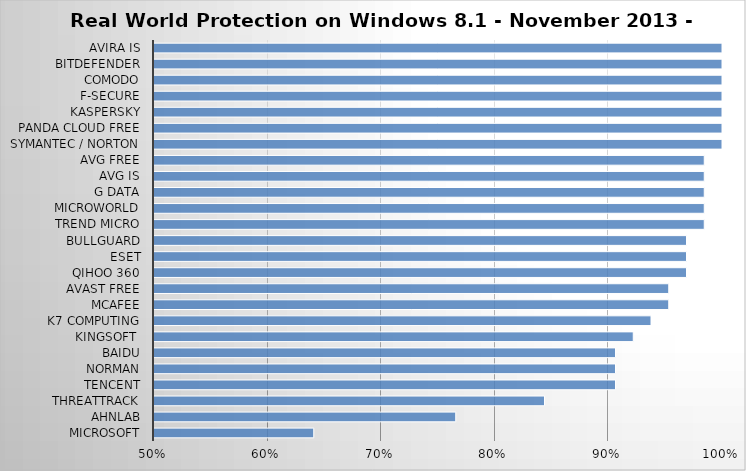
| Category | Series 0 |
|---|---|
| Microsoft | 0.641 |
| AhnLab | 0.766 |
| ThreatTrack | 0.844 |
| Tencent | 0.906 |
| Norman | 0.906 |
| Baidu | 0.906 |
| Kingsoft  | 0.922 |
| K7 Computing | 0.938 |
| McAfee | 0.953 |
| Avast Free | 0.953 |
| Qihoo 360 | 0.969 |
| ESET | 0.969 |
| BullGuard | 0.969 |
| Trend Micro | 0.984 |
| Microworld | 0.984 |
| G Data | 0.984 |
| AVG IS | 0.984 |
| AVG Free | 0.984 |
| Symantec / Norton | 1 |
| Panda Cloud Free | 1 |
| Kaspersky | 1 |
| F-Secure | 1 |
| Comodo | 1 |
| Bitdefender | 1 |
| Avira IS | 1 |